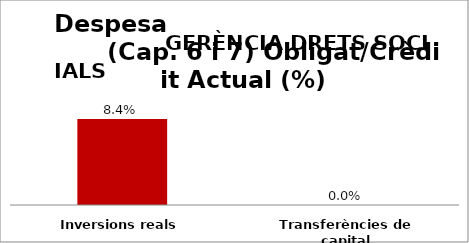
| Category | Series 0 |
|---|---|
| Inversions reals | 0.084 |
| Transferències de capital | 0 |